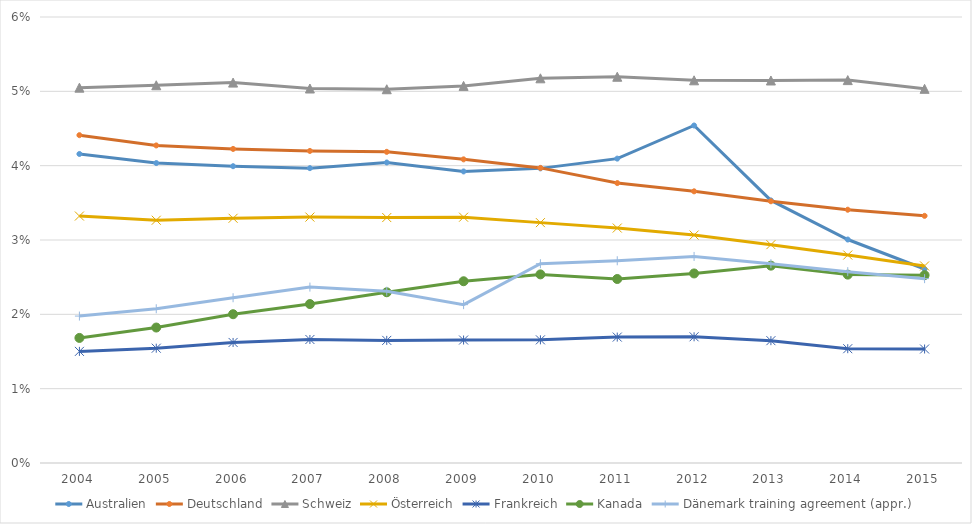
| Category | Australien | Deutschland | Schweiz | Österreich | Frankreich | Kanada | Dänemark training agreement (appr.) |
|---|---|---|---|---|---|---|---|
| 2004.0 | 0.042 | 0.044 | 0.05 | 0.033 | 0.015 | 0.017 | 0.02 |
| 2005.0 | 0.04 | 0.043 | 0.051 | 0.033 | 0.015 | 0.018 | 0.021 |
| 2006.0 | 0.04 | 0.042 | 0.051 | 0.033 | 0.016 | 0.02 | 0.022 |
| 2007.0 | 0.04 | 0.042 | 0.05 | 0.033 | 0.017 | 0.021 | 0.024 |
| 2008.0 | 0.04 | 0.042 | 0.05 | 0.033 | 0.016 | 0.023 | 0.023 |
| 2009.0 | 0.039 | 0.041 | 0.051 | 0.033 | 0.017 | 0.024 | 0.021 |
| 2010.0 | 0.04 | 0.04 | 0.052 | 0.032 | 0.017 | 0.025 | 0.027 |
| 2011.0 | 0.041 | 0.038 | 0.052 | 0.032 | 0.017 | 0.025 | 0.027 |
| 2012.0 | 0.045 | 0.037 | 0.051 | 0.031 | 0.017 | 0.026 | 0.028 |
| 2013.0 | 0.035 | 0.035 | 0.051 | 0.029 | 0.016 | 0.027 | 0.027 |
| 2014.0 | 0.03 | 0.034 | 0.052 | 0.028 | 0.015 | 0.025 | 0.026 |
| 2015.0 | 0.026 | 0.033 | 0.05 | 0.027 | 0.015 | 0.025 | 0.025 |